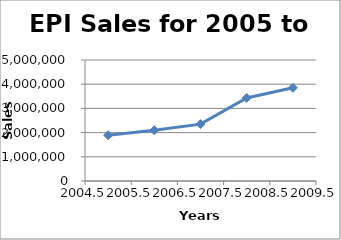
| Category | Sales |
|---|---|
| 2005.0 | 1890532 |
| 2006.0 | 2098490 |
| 2007.0 | 2350308 |
| 2008.0 | 3432000 |
| 2009.0 | 3850000 |